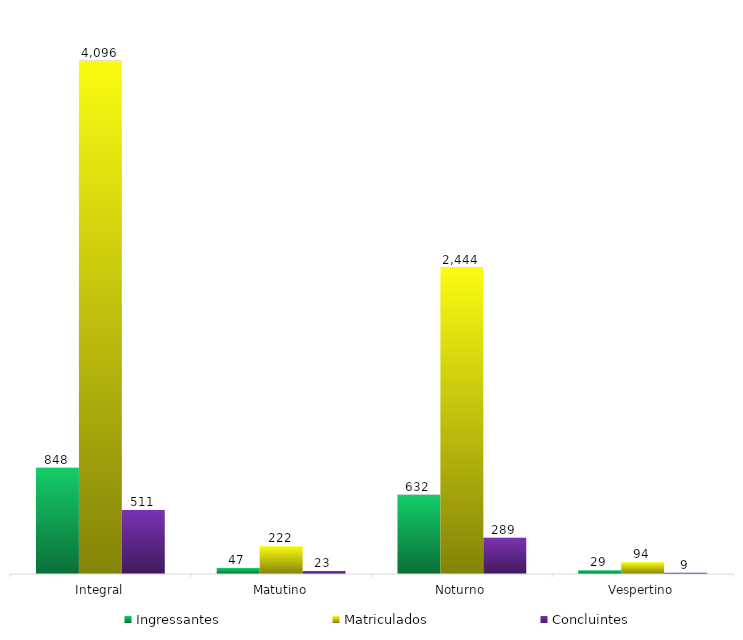
| Category | Ingressantes | Matriculados | Concluintes |
|---|---|---|---|
| 0 | 848 | 4096 | 511 |
| 1 | 47 | 222 | 23 |
| 2 | 632 | 2444 | 289 |
| 3 | 29 | 94 | 9 |